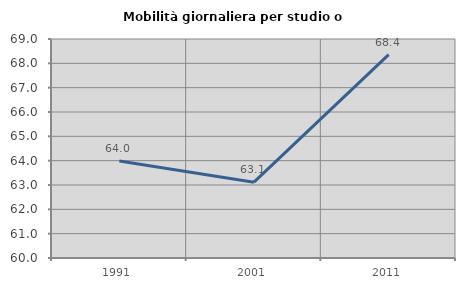
| Category | Mobilità giornaliera per studio o lavoro |
|---|---|
| 1991.0 | 63.983 |
| 2001.0 | 63.116 |
| 2011.0 | 68.359 |